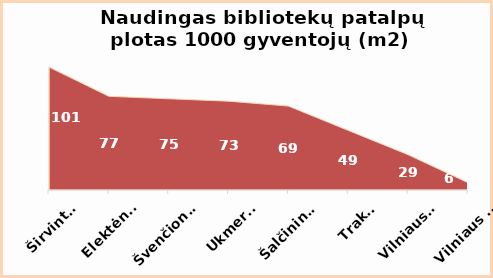
| Category | Series 0 |
|---|---|
| Širvintos | 101 |
| Elektėnai | 77 |
| Švenčionys | 75 |
| Ukmergė | 73 |
| Šalčininkai | 69 |
| Trakai | 49 |
| Vilniaus r. | 29 |
| Vilniaus m. | 6 |